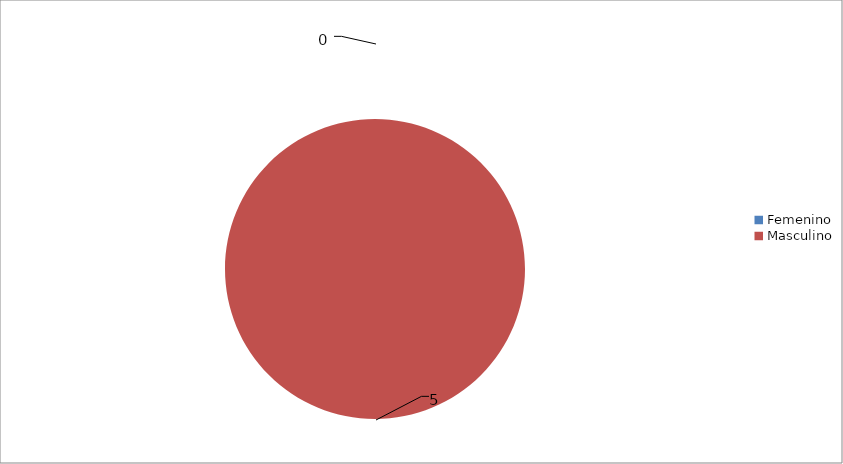
| Category | Series 0 |
|---|---|
| Femenino | 0 |
| Masculino | 5 |